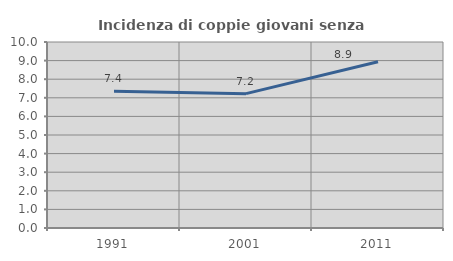
| Category | Incidenza di coppie giovani senza figli |
|---|---|
| 1991.0 | 7.353 |
| 2001.0 | 7.222 |
| 2011.0 | 8.94 |